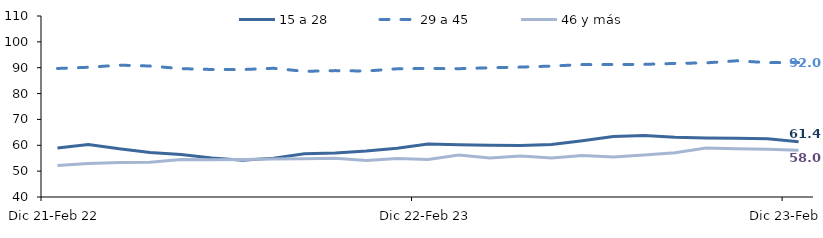
| Category | 15 a 28 | 29 a 45 | 46 y más |
|---|---|---|---|
| Dic 21-Feb 22 | 58.937 | 89.707 | 52.164 |
| Ene-Mar 2022 | 60.337 | 90.174 | 52.971 |
| Feb-Abr 2022 | 58.642 | 90.986 | 53.342 |
| Mar-May 2022 | 57.241 | 90.659 | 53.444 |
| Abr-Jun 2022 | 56.417 | 89.645 | 54.539 |
| May-Jul 2022 | 55.062 | 89.315 | 54.405 |
| Jun-Ago 2022 | 54.22 | 89.291 | 54.534 |
| Jul-Sep 2022 | 55.033 | 89.786 | 54.742 |
| Ago-Oct 2022 | 56.766 | 88.589 | 54.83 |
| Sep-Nov 2022 | 57.011 | 88.877 | 54.959 |
| Oct-Dic 2022 | 57.762 | 88.715 | 54.09 |
| Nov 22-Ene 23 | 58.879 | 89.576 | 54.874 |
| Dic 22-Feb 23 | 60.491 | 89.732 | 54.471 |
| Ene-Mar 2023 | 60.175 | 89.621 | 56.262 |
| Feb-Abr 2023 | 59.99 | 89.982 | 55.087 |
| Mar-May 2023 | 59.894 | 90.24 | 55.878 |
| Abr-Jun 2023 | 60.287 | 90.633 | 55.113 |
| May-Jul 2023 | 61.771 | 91.216 | 56.087 |
| Jun-Ago 2023 | 63.364 | 91.231 | 55.445 |
| Jul-Sep 2023 | 63.749 | 91.298 | 56.268 |
| Ago-Oct 2023 | 63.086 | 91.658 | 57.14 |
| Sep-Nov 2023 | 62.816 | 91.871 | 58.931 |
| Oct-Dic 2023 | 62.762 | 92.679 | 58.627 |
| Nov 23-Ene 24 | 62.499 | 91.974 | 58.491 |
| Dic 23-Feb 24 | 61.412 | 91.981 | 58.042 |